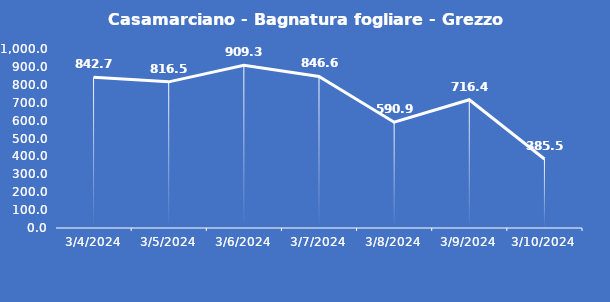
| Category | Casamarciano - Bagnatura fogliare - Grezzo (min) |
|---|---|
| 3/4/24 | 842.7 |
| 3/5/24 | 816.5 |
| 3/6/24 | 909.3 |
| 3/7/24 | 846.6 |
| 3/8/24 | 590.9 |
| 3/9/24 | 716.4 |
| 3/10/24 | 385.5 |